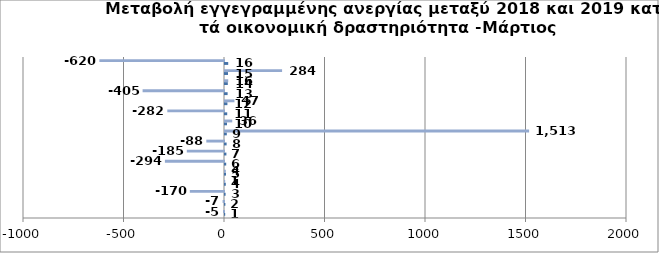
| Category | Series 0 | Series 1 |
|---|---|---|
| 0 | 1 | -5 |
| 1 | 2 | -7 |
| 2 | 3 | -170 |
| 3 | 4 | 1 |
| 4 | 5 | 4 |
| 5 | 6 | -294 |
| 6 | 7 | -185 |
| 7 | 8 | -88 |
| 8 | 9 | 1513 |
| 9 | 10 | 36 |
| 10 | 11 | -282 |
| 11 | 12 | 47 |
| 12 | 13 | -405 |
| 13 | 14 | 16 |
| 14 | 15 | 284 |
| 15 | 16 | -620 |